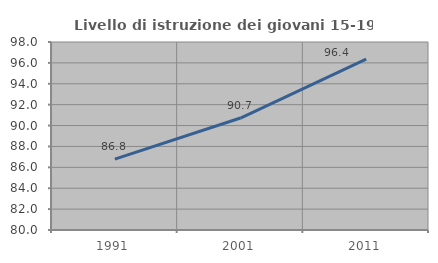
| Category | Livello di istruzione dei giovani 15-19 anni |
|---|---|
| 1991.0 | 86.792 |
| 2001.0 | 90.722 |
| 2011.0 | 96.364 |